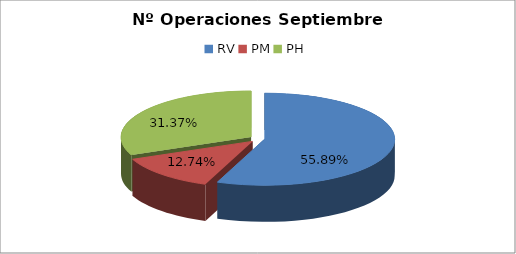
| Category | Series 0 |
|---|---|
| RV | 15837 |
| PM | 3610 |
| PH | 8889 |